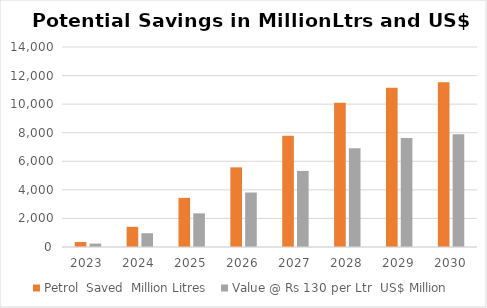
| Category | Petrol  Saved  Million Litres  | Value @ Rs 130 per Ltr  US$ Million  |
|---|---|---|
| 2023.0 | 347.933 | 238.06 |
| 2024.0 | 1410.467 | 965.056 |
| 2025.0 | 3441.467 | 2354.688 |
| 2026.0 | 5574.267 | 3813.972 |
| 2027.0 | 7782.667 | 5324.982 |
| 2028.0 | 10092.867 | 6905.646 |
| 2029.0 | 11149.5 | 7628.605 |
| 2030.0 | 11527.567 | 7887.282 |